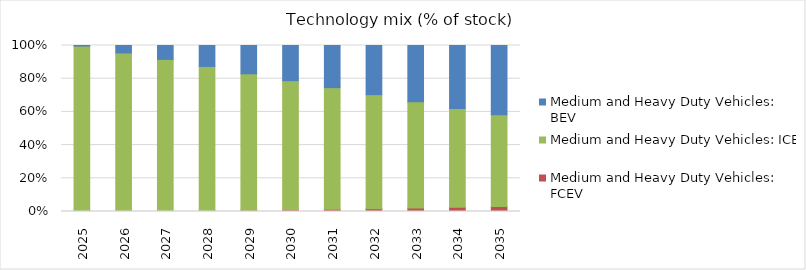
| Category | Medium and Heavy Duty Vehicles: FCEV | Medium and Heavy Duty Vehicles: ICE | Medium and Heavy Duty Vehicles: BEV |
|---|---|---|---|
| 2025.0 | 0.004 | 0.992 | 0.003 |
| 2026.0 | 0.004 | 0.951 | 0.045 |
| 2027.0 | 0.005 | 0.912 | 0.084 |
| 2028.0 | 0.006 | 0.868 | 0.126 |
| 2029.0 | 0.008 | 0.822 | 0.17 |
| 2030.0 | 0.011 | 0.778 | 0.212 |
| 2031.0 | 0.014 | 0.733 | 0.254 |
| 2032.0 | 0.017 | 0.687 | 0.296 |
| 2033.0 | 0.021 | 0.641 | 0.338 |
| 2034.0 | 0.025 | 0.596 | 0.379 |
| 2035.0 | 0.03 | 0.553 | 0.417 |